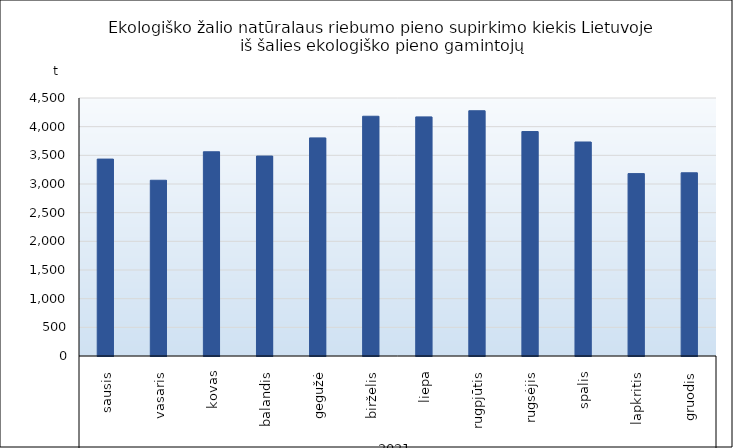
| Category | Ekologiško žalio natūralaus riebumo pieno supirkimo kiekis Lietuvoje iš šalies ekologiško pieno gamintojų |
|---|---|
| 0 | 3434.485 |
| 1 | 3065.25 |
| 2 | 3562.153 |
| 3 | 3487.749 |
| 4 | 3804.445 |
| 5 | 4181.819 |
| 6 | 4170.687 |
| 7 | 4277.637 |
| 8 | 3914.937 |
| 9 | 3732.626 |
| 10 | 3181.219 |
| 11 | 3195.47 |